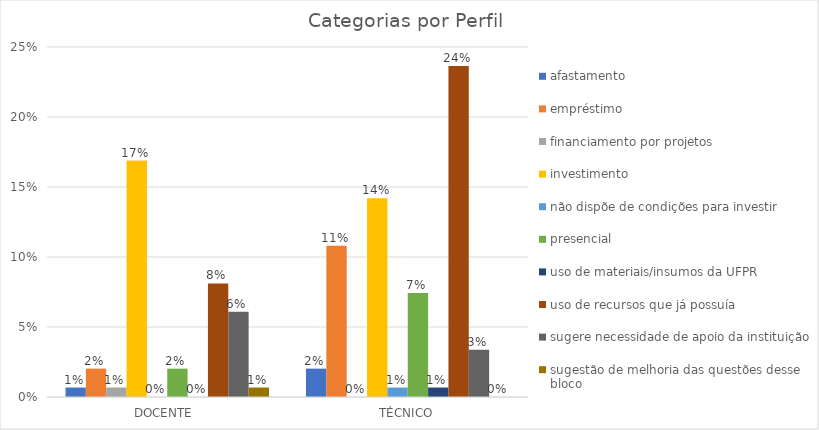
| Category | afastamento | empréstimo | financiamento por projetos | investimento | não dispõe de condições para investir | presencial | uso de materiais/insumos da UFPR | uso de recursos que já possuía | sugere necessidade de apoio da instituição  | sugestão de melhoria das questões desse bloco |
|---|---|---|---|---|---|---|---|---|---|---|
| DOCENTE  | 0.007 | 0.02 | 0.007 | 0.169 | 0 | 0.02 | 0 | 0.081 | 0.061 | 0.007 |
| TÉCNICO | 0.02 | 0.108 | 0 | 0.142 | 0.007 | 0.074 | 0.007 | 0.236 | 0.034 | 0 |